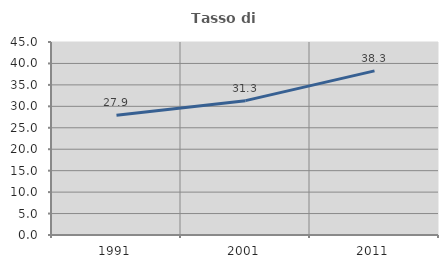
| Category | Tasso di occupazione   |
|---|---|
| 1991.0 | 27.911 |
| 2001.0 | 31.324 |
| 2011.0 | 38.268 |